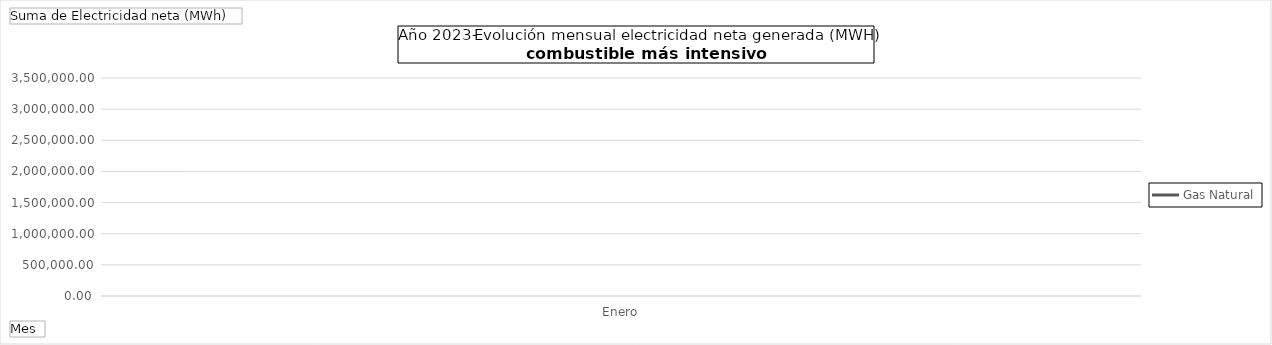
| Category | Gas Natural |
|---|---|
| Enero | 3067602.553 |